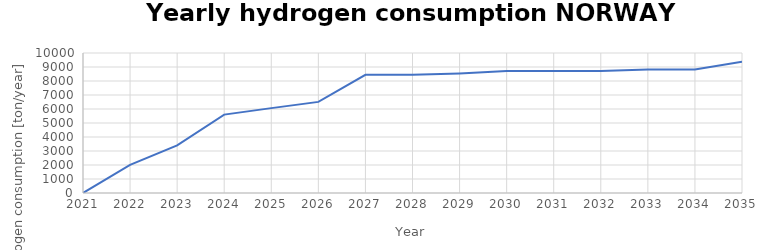
| Category | NORGE |
|---|---|
| 2021.0 | 0 |
| 2022.0 | 2005.334 |
| 2023.0 | 3401.734 |
| 2024.0 | 5600.734 |
| 2025.0 | 6062.445 |
| 2026.0 | 6508.535 |
| 2027.0 | 8442.621 |
| 2028.0 | 8442.621 |
| 2029.0 | 8542.021 |
| 2030.0 | 8709.88 |
| 2031.0 | 8709.88 |
| 2032.0 | 8709.88 |
| 2033.0 | 8821.949 |
| 2034.0 | 8821.949 |
| 2035.0 | 9378.654 |